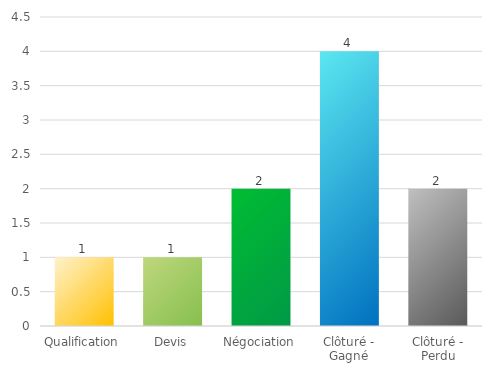
| Category | Series 0 |
|---|---|
| Qualification | 1 |
| Devis | 1 |
| Négociation | 2 |
| Clôturé - Gagné | 4 |
| Clôturé - Perdu | 2 |